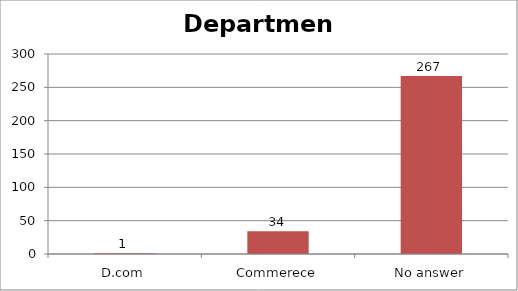
| Category | Department |
|---|---|
| D.com | 1 |
| Commerece | 34 |
| No answer | 267 |